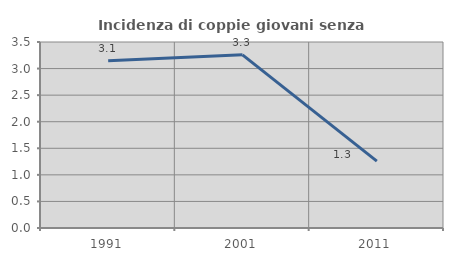
| Category | Incidenza di coppie giovani senza figli |
|---|---|
| 1991.0 | 3.149 |
| 2001.0 | 3.258 |
| 2011.0 | 1.259 |